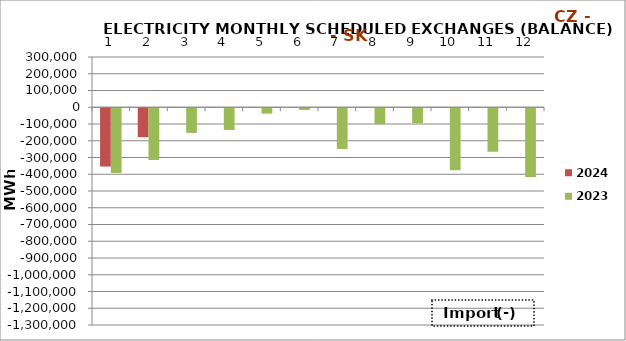
| Category | 2024 | 2023 |
|---|---|---|
| 0 | -348027 | -386324.7 |
| 1 | -172761.4 | -308766.1 |
| 2 | 0 | -147387.7 |
| 3 | 0 | -129446.5 |
| 4 | 0 | -32010.3 |
| 5 | 0 | -10652.4 |
| 6 | 0 | -243010.4 |
| 7 | 0 | -94879.3 |
| 8 | 0 | -89468.2 |
| 9 | 0 | -370007.5 |
| 10 | 0 | -259810.2 |
| 11 | 0 | -410898 |